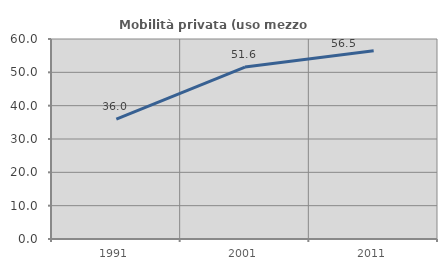
| Category | Mobilità privata (uso mezzo privato) |
|---|---|
| 1991.0 | 35.981 |
| 2001.0 | 51.593 |
| 2011.0 | 56.471 |